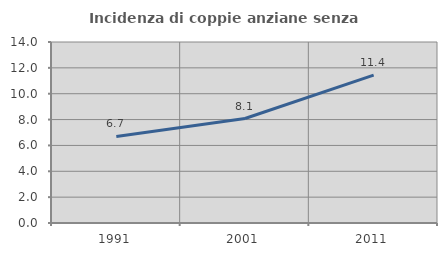
| Category | Incidenza di coppie anziane senza figli  |
|---|---|
| 1991.0 | 6.697 |
| 2001.0 | 8.08 |
| 2011.0 | 11.441 |